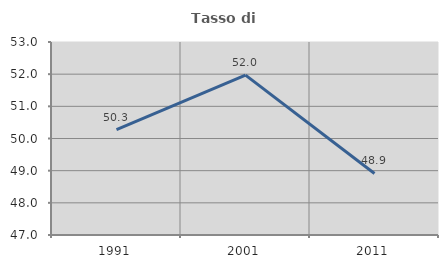
| Category | Tasso di occupazione   |
|---|---|
| 1991.0 | 50.274 |
| 2001.0 | 51.97 |
| 2011.0 | 48.912 |